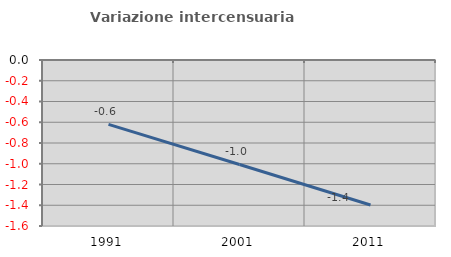
| Category | Variazione intercensuaria annua |
|---|---|
| 1991.0 | -0.621 |
| 2001.0 | -1.007 |
| 2011.0 | -1.397 |